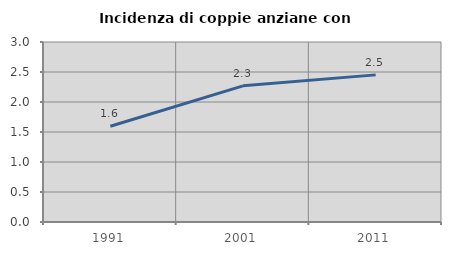
| Category | Incidenza di coppie anziane con figli |
|---|---|
| 1991.0 | 1.596 |
| 2001.0 | 2.269 |
| 2011.0 | 2.452 |